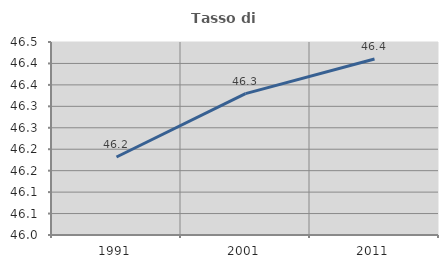
| Category | Tasso di occupazione   |
|---|---|
| 1991.0 | 46.182 |
| 2001.0 | 46.33 |
| 2011.0 | 46.41 |